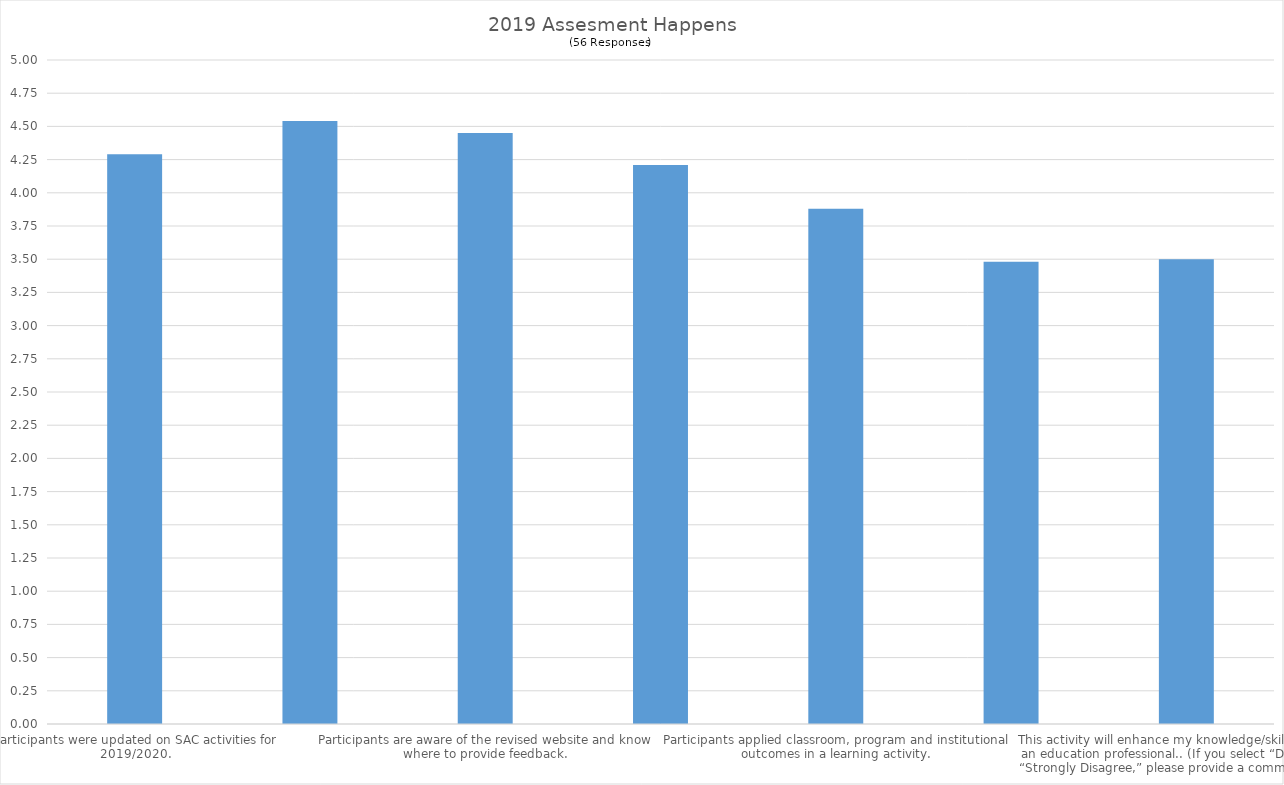
| Category | 2019 Assement Happens |
|---|---|
| Participants were updated on SAC activities for 2019/2020. | 4.29 |
| Participants know contact persons for SLOs | 4.54 |
| Participants are aware of the revised website and know where to provide feedback. | 4.45 |
| Participants know who to contact to incorporate Canvas assessments for institutional learning outcomes. | 4.21 |
| Participants applied classroom, program and institutional outcomes in a learning activity. | 3.88 |
| I found this activity worthwhile for my professional practice. (If you select “Disagree” or “Strongly Disagree,” please provide a comment below.) | 3.48 |
|  This activity will enhance my knowledge/skill/practice as an education professional.. (If you select “Disagree” or “Strongly Disagree,” please provide a comment below.) | 3.5 |